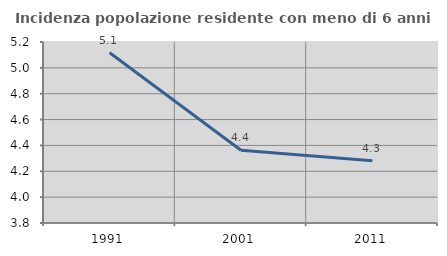
| Category | Incidenza popolazione residente con meno di 6 anni |
|---|---|
| 1991.0 | 5.116 |
| 2001.0 | 4.363 |
| 2011.0 | 4.281 |